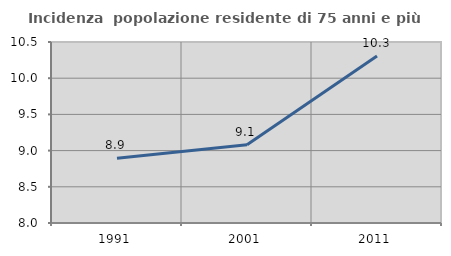
| Category | Incidenza  popolazione residente di 75 anni e più |
|---|---|
| 1991.0 | 8.895 |
| 2001.0 | 9.081 |
| 2011.0 | 10.305 |